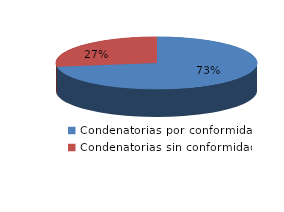
| Category | Series 0 |
|---|---|
| 0 | 117 |
| 1 | 44 |